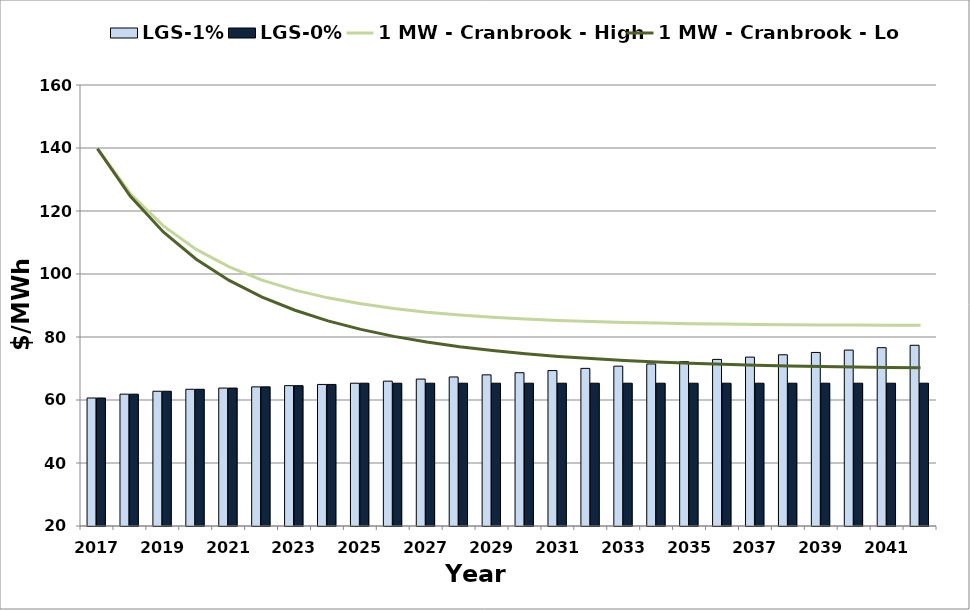
| Category | LGS-1% | LGS-0% |
|---|---|---|
| 2017.0 | 60.638 | 60.638 |
| 2018.0 | 61.85 | 61.85 |
| 2019.0 | 62.778 | 62.778 |
| 2020.0 | 63.406 | 63.406 |
| 2021.0 | 63.786 | 63.786 |
| 2022.0 | 64.169 | 64.169 |
| 2023.0 | 64.554 | 64.554 |
| 2024.0 | 64.941 | 64.941 |
| 2025.0 | 65.331 | 65.331 |
| 2026.0 | 65.984 | 65.331 |
| 2027.0 | 66.644 | 65.331 |
| 2028.0 | 67.311 | 65.331 |
| 2029.0 | 67.984 | 65.331 |
| 2030.0 | 68.663 | 65.331 |
| 2031.0 | 69.35 | 65.331 |
| 2032.0 | 70.044 | 65.331 |
| 2033.0 | 70.744 | 65.331 |
| 2034.0 | 71.451 | 65.331 |
| 2035.0 | 72.166 | 65.331 |
| 2036.0 | 72.888 | 65.331 |
| 2037.0 | 73.617 | 65.331 |
| 2038.0 | 74.353 | 65.331 |
| 2039.0 | 75.096 | 65.331 |
| 2040.0 | 75.847 | 65.331 |
| 2041.0 | 76.606 | 65.331 |
| 2042.0 | 77.372 | 65.331 |